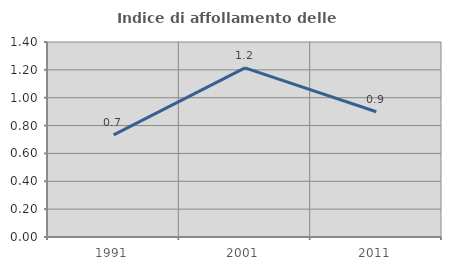
| Category | Indice di affollamento delle abitazioni  |
|---|---|
| 1991.0 | 0.733 |
| 2001.0 | 1.214 |
| 2011.0 | 0.9 |